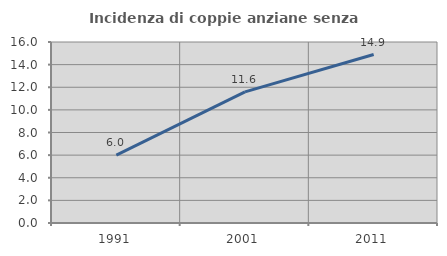
| Category | Incidenza di coppie anziane senza figli  |
|---|---|
| 1991.0 | 5.996 |
| 2001.0 | 11.594 |
| 2011.0 | 14.894 |